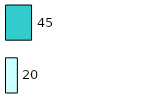
| Category | Series 0 | Series 1 |
|---|---|---|
| 0 | 20 | 45 |